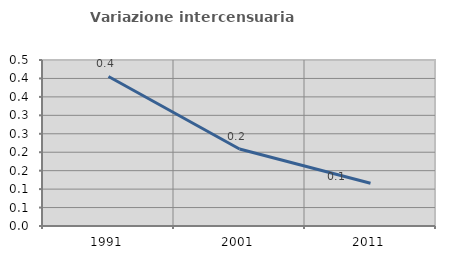
| Category | Variazione intercensuaria annua |
|---|---|
| 1991.0 | 0.405 |
| 2001.0 | 0.209 |
| 2011.0 | 0.116 |